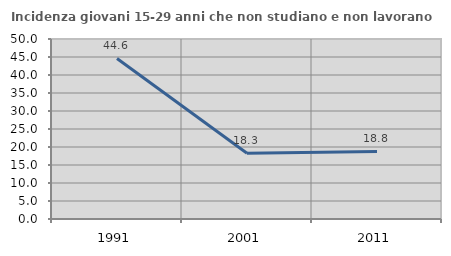
| Category | Incidenza giovani 15-29 anni che non studiano e non lavorano  |
|---|---|
| 1991.0 | 44.59 |
| 2001.0 | 18.25 |
| 2011.0 | 18.776 |